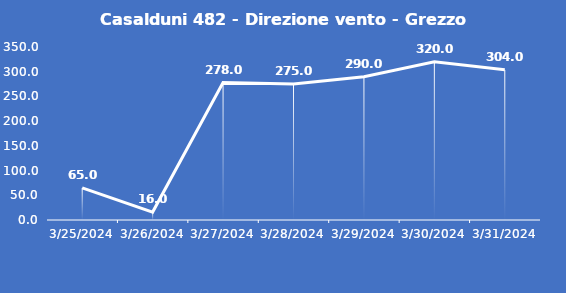
| Category | Casalduni 482 - Direzione vento - Grezzo (°N) |
|---|---|
| 3/25/24 | 65 |
| 3/26/24 | 16 |
| 3/27/24 | 278 |
| 3/28/24 | 275 |
| 3/29/24 | 290 |
| 3/30/24 | 320 |
| 3/31/24 | 304 |